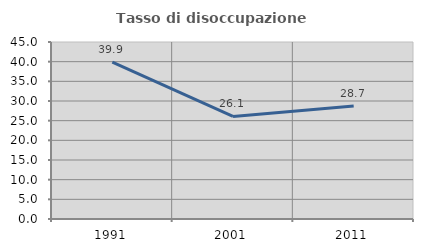
| Category | Tasso di disoccupazione giovanile  |
|---|---|
| 1991.0 | 39.913 |
| 2001.0 | 26.075 |
| 2011.0 | 28.74 |